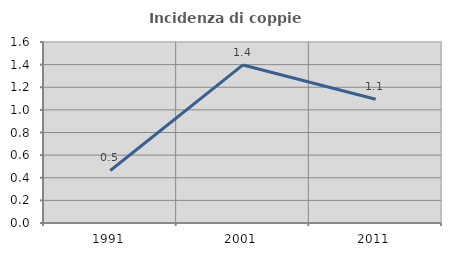
| Category | Incidenza di coppie miste |
|---|---|
| 1991.0 | 0.464 |
| 2001.0 | 1.397 |
| 2011.0 | 1.094 |